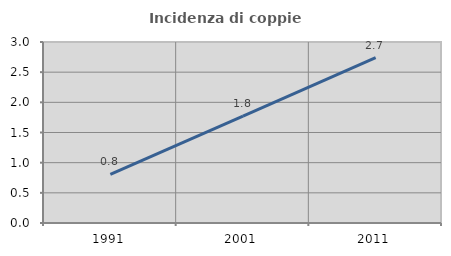
| Category | Incidenza di coppie miste |
|---|---|
| 1991.0 | 0.806 |
| 2001.0 | 1.77 |
| 2011.0 | 2.741 |